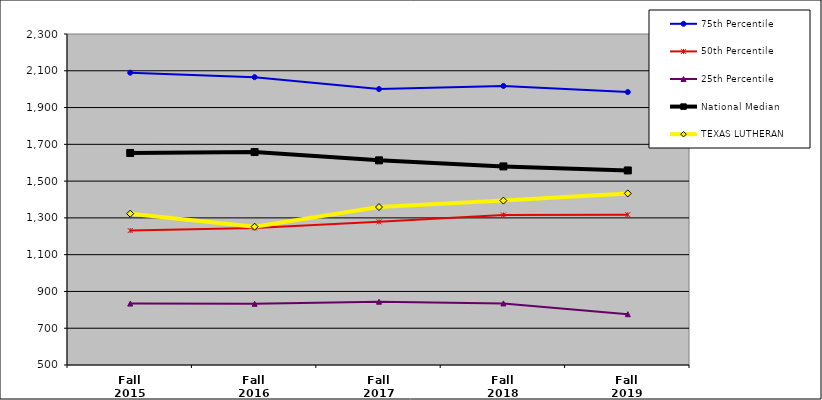
| Category | 75th Percentile | 50th Percentile | 25th Percentile | National Median | TEXAS LUTHERAN |
|---|---|---|---|---|---|
| Fall 2015 | 2089.5 | 1231 | 834 | 1653 | 1323 |
| Fall 2016 | 2065.25 | 1245.5 | 832.75 | 1658 | 1252 |
| Fall 2017 | 2000.5 | 1278.5 | 844.25 | 1613 | 1359 |
| Fall 2018 | 2017.5 | 1316 | 835 | 1580 | 1394 |
| Fall 2019 | 1984.25 | 1317.5 | 776.25 | 1558 | 1433 |